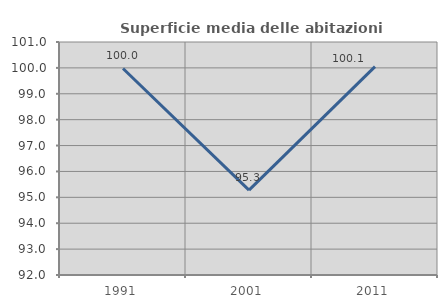
| Category | Superficie media delle abitazioni occupate |
|---|---|
| 1991.0 | 99.977 |
| 2001.0 | 95.276 |
| 2011.0 | 100.05 |